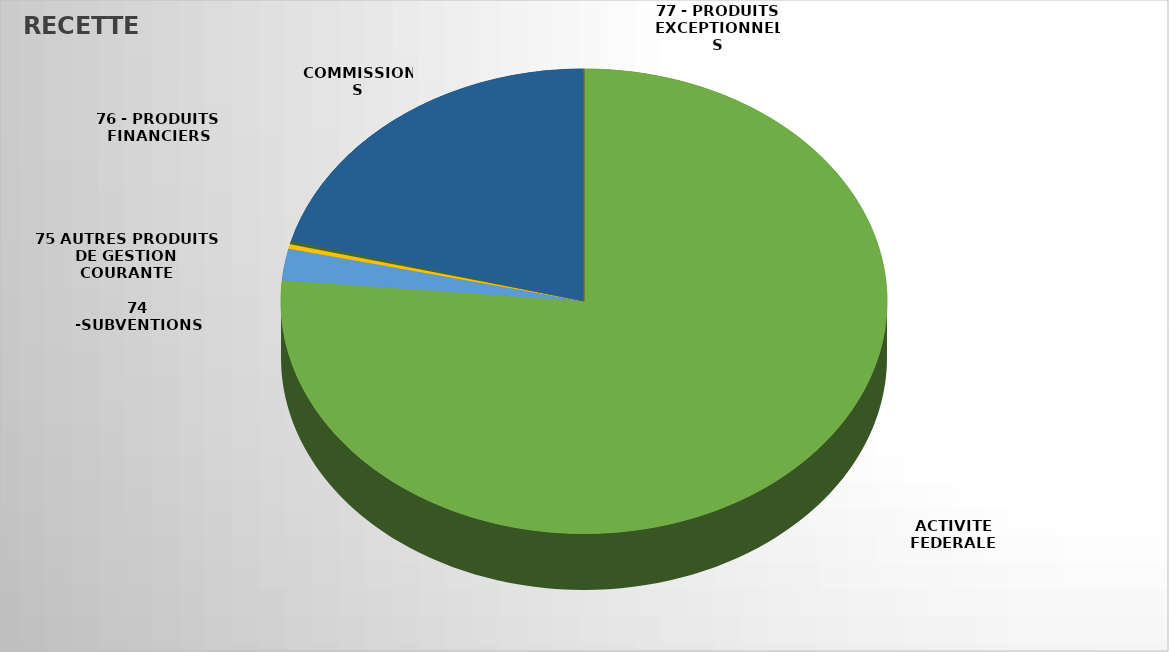
| Category | Series 0 |
|---|---|
| ACTIVITE FEDERALE | 346900 |
| 74 -SUBVENTIONS | 10000 |
| 75 AUTRES PRODUITS DE GESTION COURANTE | 1500 |
| 76 - PRODUITS FINANCIERS | 1000 |
| COMMISSIONS | 94550 |
| 77 - PRODUITS EXCEPTIONNELS | 0 |